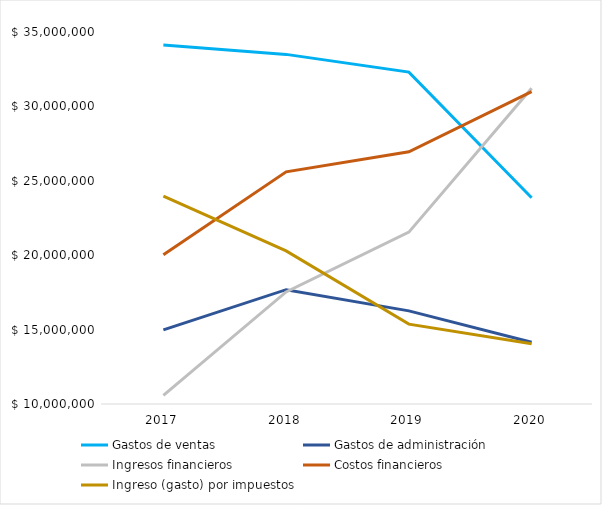
| Category |  Gastos de ventas  |  Gastos de administración  |  Ingresos financieros  |  Costos financieros  |  Ingreso (gasto) por impuestos  |
|---|---|---|---|---|---|
| 2017.0 | 34124041 | 14979575 | 10585693 | 20033004 | 23973404 |
| 2018.0 | 33488545 | 17680812 | 17528820 | 25597800 | 20286882 |
| 2019.0 | 32299161 | 16256514 | 21545547 | 26947947 | 15366816 |
| 2020.0 | 23860740 | 14146697 | 31212038 | 30987417 | 14049840 |